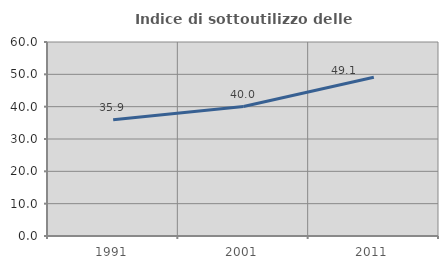
| Category | Indice di sottoutilizzo delle abitazioni  |
|---|---|
| 1991.0 | 35.933 |
| 2001.0 | 40.048 |
| 2011.0 | 49.083 |